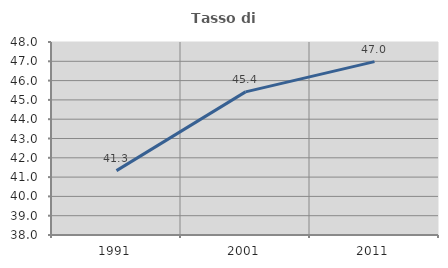
| Category | Tasso di occupazione   |
|---|---|
| 1991.0 | 41.337 |
| 2001.0 | 45.416 |
| 2011.0 | 46.984 |